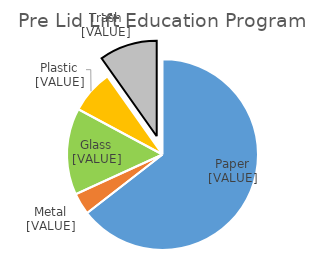
| Category | Series 0 |
|---|---|
| Paper | 0.645 |
| Metal | 0.037 |
| Glass | 0.147 |
| Plastic | 0.073 |
| Trash  | 0.098 |